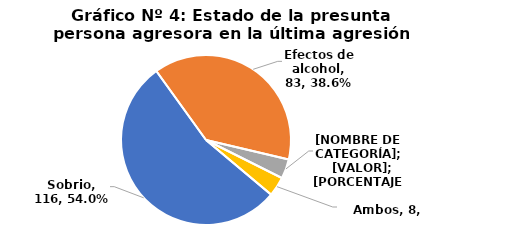
| Category | Total |
|---|---|
| Sobrio | 116 |
| Efectos de alcohol | 83 |
| Efectos de drogas | 8 |
| Ambos | 8 |